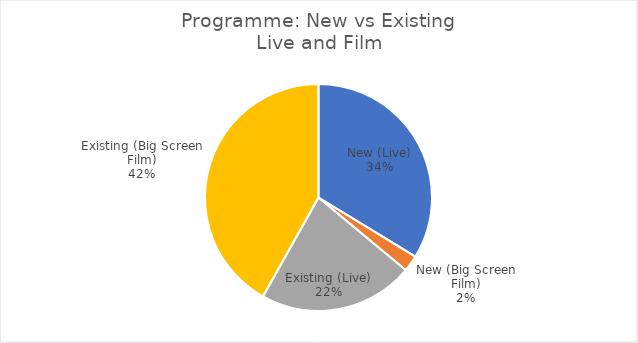
| Category | Series 0 |
|---|---|
| New (Live) | 29 |
| New (Big Screen Film) | 2 |
| Existing (Live) | 19 |
| Existing (Big Screen Film) | 36 |